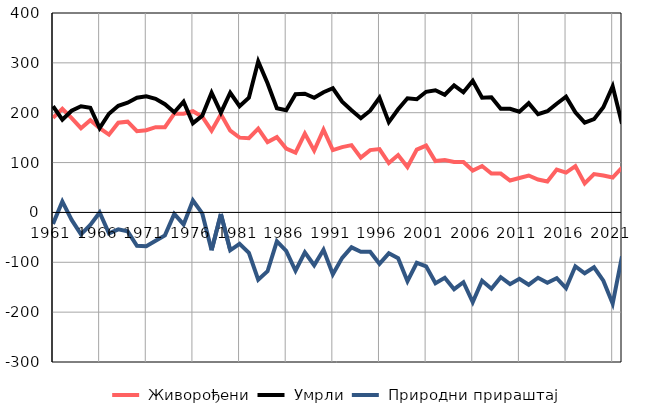
| Category |  Живорођени |  Умрли |  Природни прираштај |
|---|---|---|---|
| 1961.0 | 190 | 213 | -23 |
| 1962.0 | 208 | 186 | 22 |
| 1963.0 | 189 | 204 | -15 |
| 1964.0 | 169 | 213 | -44 |
| 1965.0 | 185 | 210 | -25 |
| 1966.0 | 169 | 169 | 0 |
| 1967.0 | 156 | 198 | -42 |
| 1968.0 | 180 | 214 | -34 |
| 1969.0 | 182 | 220 | -38 |
| 1970.0 | 163 | 230 | -67 |
| 1971.0 | 165 | 233 | -68 |
| 1972.0 | 171 | 228 | -57 |
| 1973.0 | 171 | 217 | -46 |
| 1974.0 | 198 | 201 | -3 |
| 1975.0 | 198 | 222 | -24 |
| 1976.0 | 203 | 179 | 24 |
| 1977.0 | 192 | 194 | -2 |
| 1978.0 | 164 | 240 | -76 |
| 1979.0 | 197 | 200 | -3 |
| 1980.0 | 164 | 240 | -76 |
| 1981.0 | 150 | 213 | -63 |
| 1982.0 | 149 | 230 | -81 |
| 1983.0 | 168 | 303 | -135 |
| 1984.0 | 141 | 259 | -118 |
| 1985.0 | 151 | 209 | -58 |
| 1986.0 | 128 | 205 | -77 |
| 1987.0 | 120 | 237 | -117 |
| 1988.0 | 158 | 238 | -80 |
| 1989.0 | 124 | 230 | -106 |
| 1990.0 | 166 | 241 | -75 |
| 1991.0 | 125 | 249 | -124 |
| 1992.0 | 131 | 222 | -91 |
| 1993.0 | 135 | 205 | -70 |
| 1994.0 | 110 | 189 | -79 |
| 1995.0 | 125 | 204 | -79 |
| 1996.0 | 127 | 230 | -103 |
| 1997.0 | 99 | 181 | -82 |
| 1998.0 | 115 | 207 | -92 |
| 1999.0 | 91 | 229 | -138 |
| 2000.0 | 126 | 227 | -101 |
| 2001.0 | 134 | 242 | -108 |
| 2002.0 | 103 | 245 | -142 |
| 2003.0 | 105 | 236 | -131 |
| 2004.0 | 101 | 255 | -154 |
| 2005.0 | 101 | 241 | -140 |
| 2006.0 | 84 | 264 | -180 |
| 2007.0 | 93 | 230 | -137 |
| 2008.0 | 78 | 231 | -153 |
| 2009.0 | 78 | 208 | -130 |
| 2010.0 | 64 | 208 | -144 |
| 2011.0 | 69 | 202 | -133 |
| 2012.0 | 74 | 219 | -145 |
| 2013.0 | 66 | 197 | -131 |
| 2014.0 | 62 | 203 | -141 |
| 2015.0 | 86 | 218 | -132 |
| 2016.0 | 80 | 232 | -152 |
| 2017.0 | 93 | 201 | -108 |
| 2018.0 | 58 | 180 | -122 |
| 2019.0 | 77 | 187 | -110 |
| 2020.0 | 74 | 211 | -137 |
| 2021.0 | 70 | 253 | -183 |
| 2022.0 | 90 | 178 | -88 |